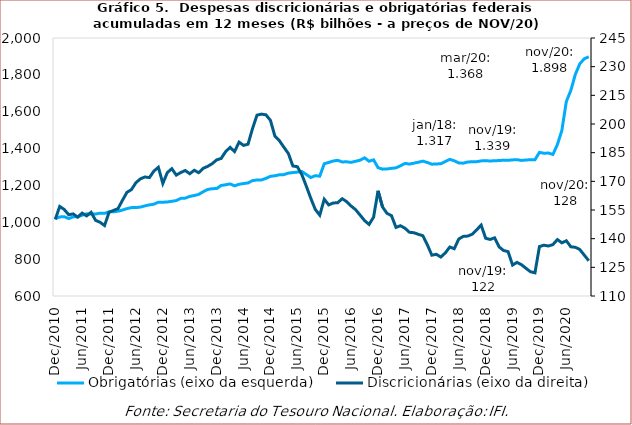
| Category | Obrigatórias (eixo da esquerda) |
|---|---|
| 2010-12-01 | 1019268.488 |
| 2011-01-01 | 1028968.195 |
| 2011-02-01 | 1030478.385 |
| 2011-03-01 | 1020150.306 |
| 2011-04-01 | 1029377.566 |
| 2011-05-01 | 1029752.814 |
| 2011-06-01 | 1038262.789 |
| 2011-07-01 | 1045947.792 |
| 2011-08-01 | 1044756.501 |
| 2011-09-01 | 1044921.731 |
| 2011-10-01 | 1049230.253 |
| 2011-11-01 | 1048635.85 |
| 2011-12-01 | 1056548.687 |
| 2012-01-01 | 1056731.424 |
| 2012-02-01 | 1060168.531 |
| 2012-03-01 | 1066349.14 |
| 2012-04-01 | 1074325.132 |
| 2012-05-01 | 1079533.443 |
| 2012-06-01 | 1079897.57 |
| 2012-07-01 | 1082484.552 |
| 2012-08-01 | 1089140.871 |
| 2012-09-01 | 1094473.286 |
| 2012-10-01 | 1098153.465 |
| 2012-11-01 | 1108821.365 |
| 2012-12-01 | 1108888.274 |
| 2013-01-01 | 1110114.713 |
| 2013-02-01 | 1113925.895 |
| 2013-03-01 | 1117767.126 |
| 2013-04-01 | 1129815.728 |
| 2013-05-01 | 1131093.469 |
| 2013-06-01 | 1140202.069 |
| 2013-07-01 | 1145301.903 |
| 2013-08-01 | 1151226.669 |
| 2013-09-01 | 1165789.475 |
| 2013-10-01 | 1177824.205 |
| 2013-11-01 | 1182466.615 |
| 2013-12-01 | 1182830.555 |
| 2014-01-01 | 1199748.85 |
| 2014-02-01 | 1203687.453 |
| 2014-03-01 | 1208173.396 |
| 2014-04-01 | 1197804.4 |
| 2014-05-01 | 1206282.693 |
| 2014-06-01 | 1210044.519 |
| 2014-07-01 | 1213630.706 |
| 2014-08-01 | 1226171.642 |
| 2014-09-01 | 1229729.386 |
| 2014-10-01 | 1229874.869 |
| 2014-11-01 | 1238277.235 |
| 2014-12-01 | 1249549.266 |
| 2015-01-01 | 1252289.086 |
| 2015-02-01 | 1257738.899 |
| 2015-03-01 | 1258667.64 |
| 2015-04-01 | 1266898.284 |
| 2015-05-01 | 1269705.522 |
| 2015-06-01 | 1272367.066 |
| 2015-07-01 | 1275410.132 |
| 2015-08-01 | 1259415.622 |
| 2015-09-01 | 1242722.563 |
| 2015-10-01 | 1252824.774 |
| 2015-11-01 | 1250291.737 |
| 2015-12-01 | 1317333.901 |
| 2016-01-01 | 1324792.43 |
| 2016-02-01 | 1332422.143 |
| 2016-03-01 | 1336240.298 |
| 2016-04-01 | 1327542.787 |
| 2016-05-01 | 1328226.52 |
| 2016-06-01 | 1325068.054 |
| 2016-07-01 | 1331031.59 |
| 2016-08-01 | 1337096.495 |
| 2016-09-01 | 1349817.947 |
| 2016-10-01 | 1331211.303 |
| 2016-11-01 | 1338905.168 |
| 2016-12-01 | 1296363.05 |
| 2017-01-01 | 1288346.195 |
| 2017-02-01 | 1289463.703 |
| 2017-03-01 | 1292755.703 |
| 2017-04-01 | 1295466.013 |
| 2017-05-01 | 1306468.104 |
| 2017-06-01 | 1319317.512 |
| 2017-07-01 | 1316040.299 |
| 2017-08-01 | 1320805.212 |
| 2017-09-01 | 1325985.791 |
| 2017-10-01 | 1331830.436 |
| 2017-11-01 | 1324432.378 |
| 2017-12-01 | 1315239.746 |
| 2018-01-01 | 1316648.7 |
| 2018-02-01 | 1317453.762 |
| 2018-03-01 | 1329414.768 |
| 2018-04-01 | 1341477.333 |
| 2018-05-01 | 1333701.671 |
| 2018-06-01 | 1322245.672 |
| 2018-07-01 | 1320650.15 |
| 2018-08-01 | 1327299.586 |
| 2018-09-01 | 1328484.549 |
| 2018-10-01 | 1329056.511 |
| 2018-11-01 | 1333046.752 |
| 2018-12-01 | 1334583.736 |
| 2019-01-01 | 1332497.54 |
| 2019-02-01 | 1334139.605 |
| 2019-03-01 | 1334820.628 |
| 2019-04-01 | 1337322.695 |
| 2019-05-01 | 1336275.513 |
| 2019-06-01 | 1338511.119 |
| 2019-07-01 | 1339763.9 |
| 2019-08-01 | 1335692.765 |
| 2019-09-01 | 1337952.746 |
| 2019-10-01 | 1339710.528 |
| 2019-11-01 | 1339283.34 |
| 2019-12-01 | 1379308.484 |
| 2020-01-01 | 1374748.103 |
| 2020-02-01 | 1375680.223 |
| 2020-03-01 | 1368345.081 |
| 2020-04-01 | 1421361.934 |
| 2020-05-01 | 1498597.147 |
| 2020-06-01 | 1655520.441 |
| 2020-07-01 | 1715330.577 |
| 2020-08-01 | 1802082.908 |
| 2020-09-01 | 1859658.834 |
| 2020-10-01 | 1887282.034 |
| 2020-11-01 | 1898071.873 |